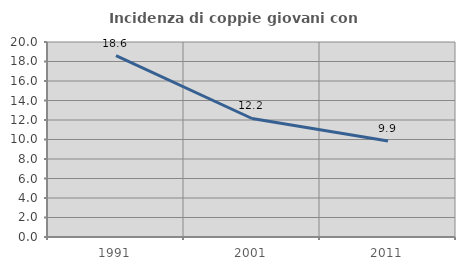
| Category | Incidenza di coppie giovani con figli |
|---|---|
| 1991.0 | 18.605 |
| 2001.0 | 12.155 |
| 2011.0 | 9.852 |